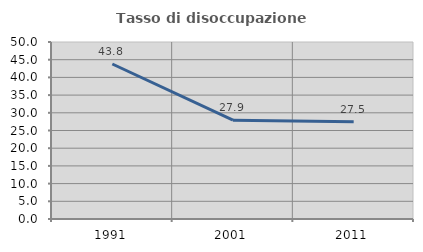
| Category | Tasso di disoccupazione giovanile  |
|---|---|
| 1991.0 | 43.787 |
| 2001.0 | 27.907 |
| 2011.0 | 27.5 |